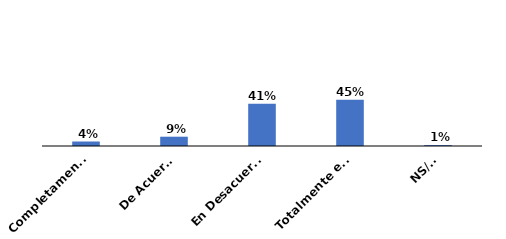
| Category | Series 0 |
|---|---|
| Completamente de acuerdo | 0.044 |
| De Acuerdo | 0.09 |
| En Desacuerdo | 0.409 |
| Totalmente en desacuerdo | 0.448 |
| NS/NR | 0.009 |